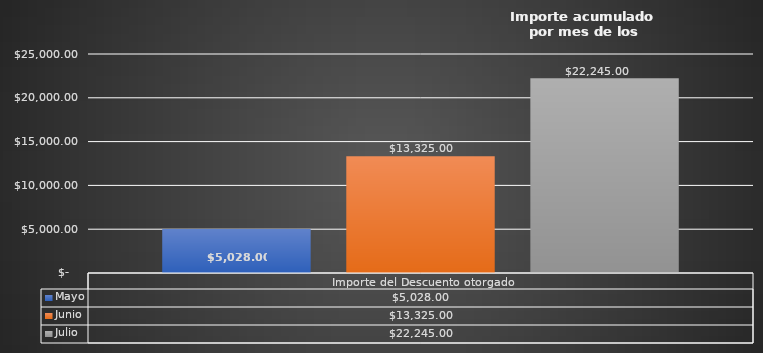
| Category | Mayo  | Junio | Julio |
|---|---|---|---|
| Importe del Descuento otorgado | 5028 | 13325 | 22245 |